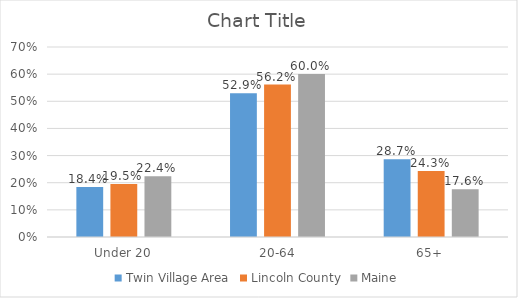
| Category | Twin Village Area | Lincoln County | Maine |
|---|---|---|---|
| Under 20 | 0.184 | 0.195 | 0.224 |
| 20-64 | 0.529 | 0.562 | 0.6 |
| 65+ | 0.287 | 0.243 | 0.176 |